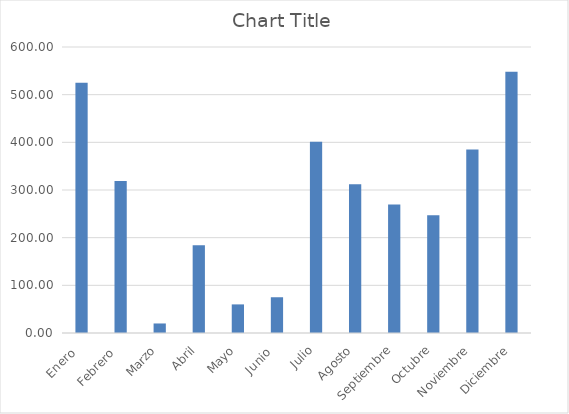
| Category | Series 0 |
|---|---|
| Enero  | 525 |
| Febrero  | 319 |
| Marzo | 20 |
| Abril | 184 |
| Mayo | 60 |
| Junio  | 75 |
| Julio | 401 |
| Agosto | 312 |
| Septiembre | 269.82 |
| Octubre | 247 |
| Noviembre | 385 |
| Diciembre | 548 |